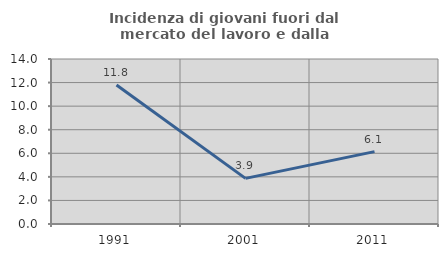
| Category | Incidenza di giovani fuori dal mercato del lavoro e dalla formazione  |
|---|---|
| 1991.0 | 11.798 |
| 2001.0 | 3.871 |
| 2011.0 | 6.14 |